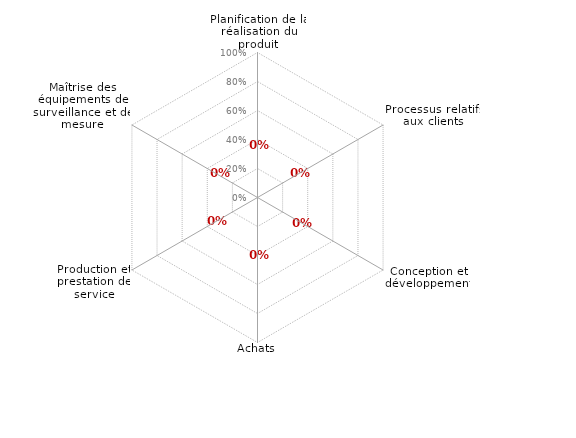
| Category | article7 |
|---|---|
| 0 | 0 |
| 1 | 0 |
| 2 | 0 |
| 3 | 0 |
| 4 | 0 |
| 5 | 0 |